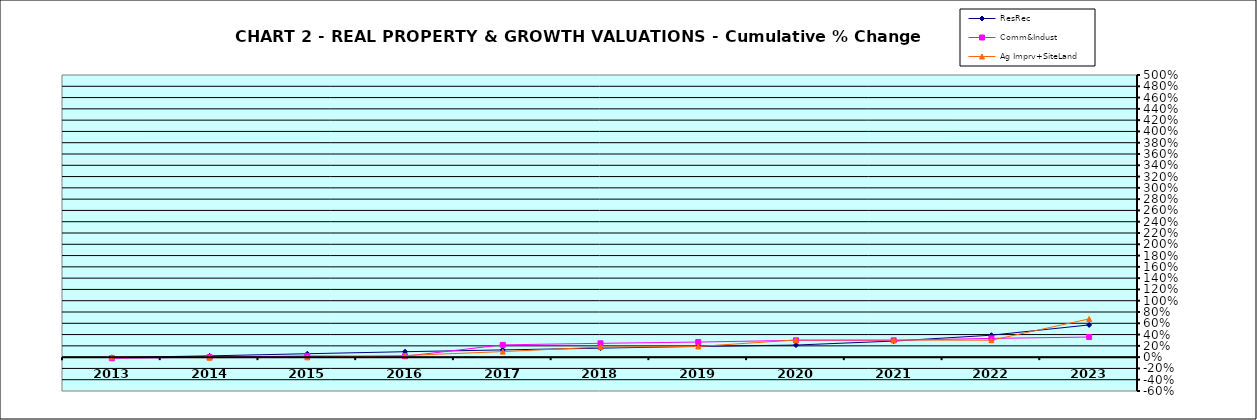
| Category | ResRec | Comm&Indust | Ag Imprv+SiteLand |
|---|---|---|---|
| 2013.0 | -0.007 | -0.02 | 0 |
| 2014.0 | 0.023 | -0.001 | -0.009 |
| 2015.0 | 0.061 | 0.021 | -0.003 |
| 2016.0 | 0.096 | 0.016 | 0.029 |
| 2017.0 | 0.128 | 0.218 | 0.098 |
| 2018.0 | 0.16 | 0.245 | 0.178 |
| 2019.0 | 0.19 | 0.267 | 0.189 |
| 2020.0 | 0.214 | 0.298 | 0.304 |
| 2021.0 | 0.285 | 0.298 | 0.305 |
| 2022.0 | 0.389 | 0.333 | 0.3 |
| 2023.0 | 0.571 | 0.356 | 0.677 |